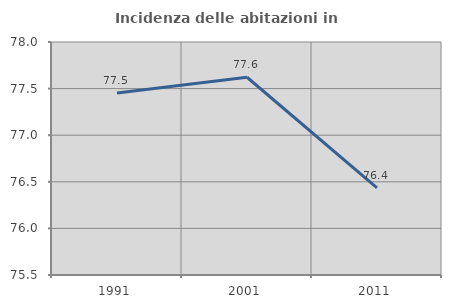
| Category | Incidenza delle abitazioni in proprietà  |
|---|---|
| 1991.0 | 77.454 |
| 2001.0 | 77.622 |
| 2011.0 | 76.434 |